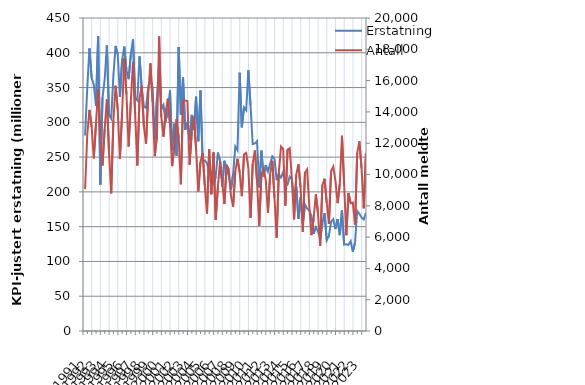
| Category | Erstatning |
|---|---|
| 1991.0 | 280.985 |
| nan | 349.596 |
| nan | 406.308 |
| nan | 363.906 |
| 1992.0 | 354.242 |
| nan | 323.679 |
| nan | 424.18 |
| nan | 210.377 |
| 1993.0 | 335.608 |
| nan | 361.604 |
| nan | 411.114 |
| nan | 310.424 |
| 1994.0 | 305.141 |
| nan | 367.419 |
| nan | 409.826 |
| nan | 397.599 |
| 1995.0 | 336.646 |
| nan | 389.436 |
| nan | 408.963 |
| nan | 374.489 |
| 1996.0 | 362.043 |
| nan | 397.439 |
| nan | 419.331 |
| nan | 335.246 |
| 1997.0 | 331.447 |
| nan | 394.772 |
| nan | 349.424 |
| nan | 323.03 |
| 1998.0 | 320.621 |
| nan | 351.716 |
| nan | 360.655 |
| nan | 350.952 |
| 1999.0 | 275.707 |
| nan | 334.543 |
| nan | 384.48 |
| nan | 318.893 |
| 2000.0 | 325.061 |
| nan | 301.457 |
| nan | 316.214 |
| nan | 345.699 |
| 2001.0 | 259.963 |
| nan | 298.167 |
| nan | 251.788 |
| nan | 408.378 |
| 2002.0 | 310.926 |
| nan | 364.524 |
| nan | 289.079 |
| nan | 300.131 |
| 2003.0 | 274.219 |
| nan | 310.724 |
| nan | 289.737 |
| nan | 336.89 |
| 2004.0 | 272.837 |
| nan | 345.871 |
| nan | 244.365 |
| nan | 245.385 |
| 2005.0 | 241.199 |
| nan | 227.326 |
| nan | 228.269 |
| nan | 210.214 |
| 2006.0 | 221.798 |
| nan | 256.494 |
| nan | 244.63 |
| nan | 207.945 |
| 2007.0 | 244.652 |
| nan | 233.707 |
| nan | 222.892 |
| nan | 202.998 |
| 2008.0 | 225.538 |
| nan | 265.187 |
| nan | 259.888 |
| nan | 371.266 |
| 2009.0 | 292.893 |
| nan | 321.453 |
| nan | 317.43 |
| nan | 374.918 |
| 2010.0 | 324.368 |
| nan | 268.577 |
| nan | 269.68 |
| nan | 272.895 |
| 2011.0 | 206.412 |
| nan | 259.29 |
| nan | 222.021 |
| nan | 238.313 |
| 2012.0 | 229.145 |
| nan | 240.189 |
| nan | 251.019 |
| nan | 247.722 |
| 2013.0 | 216.718 |
| nan | 225.258 |
| nan | 220.628 |
| nan | 228.585 |
| 2014.0 | 208.854 |
| nan | 210.191 |
| nan | 221.903 |
| nan | 218.448 |
| 2015.0 | 192.78 |
| nan | 207.708 |
| nan | 161.23 |
| nan | 192.155 |
| 2016.0 | 154.748 |
| nan | 181.619 |
| nan | 176.277 |
| nan | 173.088 |
| 2017.0 | 165.566 |
| nan | 139.74 |
| nan | 149.224 |
| nan | 143.489 |
| 2018.0 | 133.066 |
| nan | 154.435 |
| nan | 169.437 |
| nan | 130.282 |
| 2019.0 | 136.442 |
| nan | 157.213 |
| nan | 160.72 |
| nan | 146.532 |
| 2020.0 | 161.033 |
| nan | 137.824 |
| nan | 173.561 |
| nan | 124.116 |
| 2021.0 | 124.634 |
| nan | 123.751 |
| nan | 129.237 |
| nan | 113.725 |
| 2022.0 | 126.948 |
| nan | 172.605 |
| nan | 168.519 |
| nan | 163.072 |
| 2023.0 | 160.357 |
| nan | 169.947 |